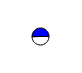
| Category | Series 0 |
|---|---|
| 0 | 12668 |
| 1 | 12824 |